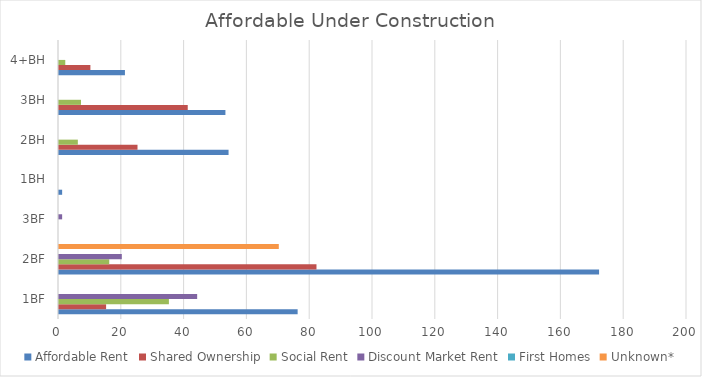
| Category | Affordable Rent | Shared Ownership | Social Rent | Discount Market Rent | First Homes | Unknown* |
|---|---|---|---|---|---|---|
| 1BF | 76 | 15 | 35 | 44 | 0 | 0 |
| 2BF | 172 | 82 | 16 | 20 | 0 | 70 |
| 3BF | 0 | 0 | 0 | 1 | 0 | 0 |
| 1BH | 1 | 0 | 0 | 0 | 0 | 0 |
| 2BH | 54 | 25 | 6 | 0 | 0 | 0 |
| 3BH | 53 | 41 | 7 | 0 | 0 | 0 |
| 4+BH | 21 | 10 | 2 | 0 | 0 | 0 |